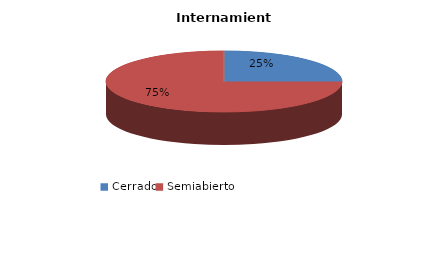
| Category | Series 0 |
|---|---|
| Cerrado | 2 |
| Semiabierto | 6 |
| Abierto | 0 |
| Terapeúticos | 0 |